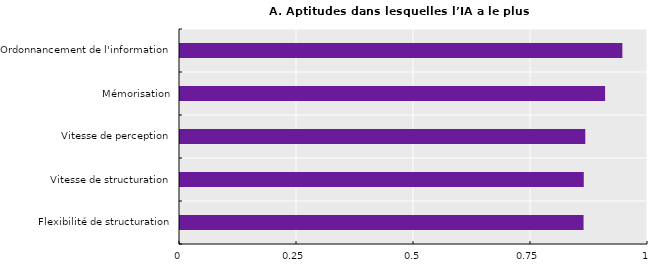
| Category | Series 0 |
|---|---|
| Flexibilité de structuration | 0.862 |
| Vitesse de structuration | 0.863 |
| Vitesse de perception | 0.866 |
| Mémorisation | 0.908 |
| Ordonnancement de l'information | 0.945 |